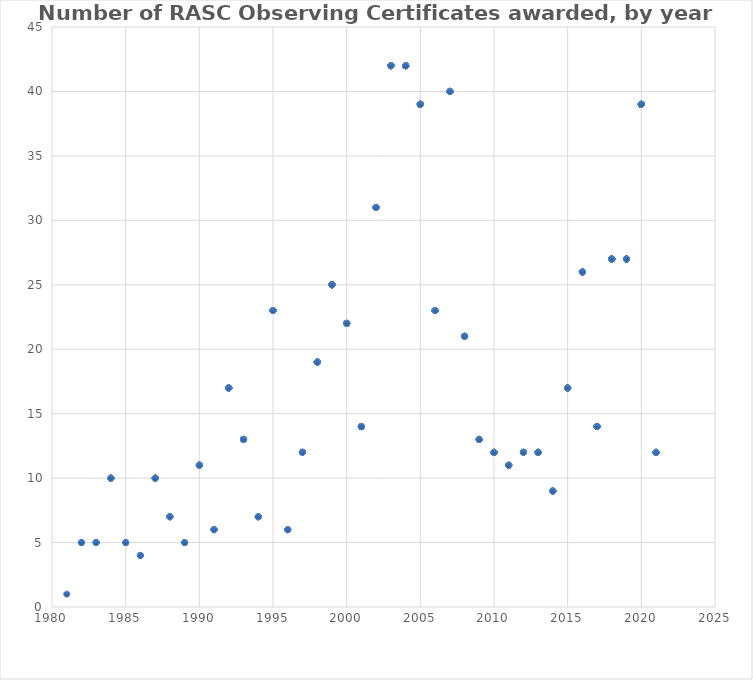
| Category | Series 0 |
|---|---|
| 2021.0 | 12 |
| 2021.0 | 12 |
| 2021.0 | 12 |
| 2021.0 | 12 |
| 2021.0 | 12 |
| 2021.0 | 12 |
| 2021.0 | 12 |
| 2021.0 | 12 |
| 2021.0 | 12 |
| 2021.0 | 12 |
| 2021.0 | 12 |
| 2021.0 | 12 |
| 2020.0 | 39 |
| 2020.0 | 39 |
| 2020.0 | 39 |
| 2020.0 | 39 |
| 2020.0 | 39 |
| 2020.0 | 39 |
| 2020.0 | 39 |
| 2020.0 | 39 |
| 2020.0 | 39 |
| 2020.0 | 39 |
| 2020.0 | 39 |
| 2020.0 | 39 |
| 2020.0 | 39 |
| 2020.0 | 39 |
| 2020.0 | 39 |
| 2020.0 | 39 |
| 2020.0 | 39 |
| 2020.0 | 39 |
| 2020.0 | 39 |
| 2020.0 | 39 |
| 2020.0 | 39 |
| 2020.0 | 39 |
| 2020.0 | 39 |
| 2020.0 | 39 |
| 2020.0 | 39 |
| 2020.0 | 39 |
| 2020.0 | 39 |
| 2020.0 | 39 |
| 2020.0 | 39 |
| 2020.0 | 39 |
| 2020.0 | 39 |
| 2020.0 | 39 |
| 2020.0 | 39 |
| 2020.0 | 39 |
| 2020.0 | 39 |
| 2020.0 | 39 |
| 2020.0 | 39 |
| 2020.0 | 39 |
| 2020.0 | 39 |
| 2019.0 | 27 |
| 2019.0 | 27 |
| 2019.0 | 27 |
| 2019.0 | 27 |
| 2019.0 | 27 |
| 2019.0 | 27 |
| 2019.0 | 27 |
| 2019.0 | 27 |
| 2019.0 | 27 |
| 2019.0 | 27 |
| 2019.0 | 27 |
| 2019.0 | 27 |
| 2019.0 | 27 |
| 2019.0 | 27 |
| 2019.0 | 27 |
| 2019.0 | 27 |
| 2019.0 | 27 |
| 2019.0 | 27 |
| 2019.0 | 27 |
| 2019.0 | 27 |
| 2019.0 | 27 |
| 2019.0 | 27 |
| 2019.0 | 27 |
| 2019.0 | 27 |
| 2019.0 | 27 |
| 2019.0 | 27 |
| 2019.0 | 27 |
| 2018.0 | 27 |
| 2018.0 | 27 |
| 2018.0 | 27 |
| 2018.0 | 27 |
| 2018.0 | 27 |
| 2018.0 | 27 |
| 2018.0 | 27 |
| 2018.0 | 27 |
| 2018.0 | 27 |
| 2018.0 | 27 |
| 2018.0 | 27 |
| 2018.0 | 27 |
| 2018.0 | 27 |
| 2018.0 | 27 |
| 2018.0 | 27 |
| 2018.0 | 27 |
| 2018.0 | 27 |
| 2018.0 | 27 |
| 2018.0 | 27 |
| 2018.0 | 27 |
| 2018.0 | 27 |
| 2018.0 | 27 |
| 2018.0 | 27 |
| 2018.0 | 27 |
| 2018.0 | 27 |
| 2018.0 | 27 |
| 2018.0 | 27 |
| 2017.0 | 14 |
| 2017.0 | 14 |
| 2017.0 | 14 |
| 2017.0 | 14 |
| 2017.0 | 14 |
| 2017.0 | 14 |
| 2017.0 | 14 |
| 2017.0 | 14 |
| 2017.0 | 14 |
| 2017.0 | 14 |
| 2017.0 | 14 |
| 2017.0 | 14 |
| 2017.0 | 14 |
| 2017.0 | 14 |
| 2016.0 | 26 |
| 2016.0 | 26 |
| 2016.0 | 26 |
| 2016.0 | 26 |
| 2016.0 | 26 |
| 2016.0 | 26 |
| 2016.0 | 26 |
| 2016.0 | 26 |
| 2016.0 | 26 |
| 2016.0 | 26 |
| 2016.0 | 26 |
| 2016.0 | 26 |
| 2016.0 | 26 |
| 2016.0 | 26 |
| 2016.0 | 26 |
| 2016.0 | 26 |
| 2016.0 | 26 |
| 2016.0 | 26 |
| 2016.0 | 26 |
| 2016.0 | 26 |
| 2016.0 | 26 |
| 2016.0 | 26 |
| 2016.0 | 26 |
| 2016.0 | 26 |
| 2016.0 | 26 |
| 2016.0 | 26 |
| 2015.0 | 17 |
| 2015.0 | 17 |
| 2015.0 | 17 |
| 2015.0 | 17 |
| 2015.0 | 17 |
| 2015.0 | 17 |
| 2015.0 | 17 |
| 2015.0 | 17 |
| 2015.0 | 17 |
| 2015.0 | 17 |
| 2015.0 | 17 |
| 2015.0 | 17 |
| 2015.0 | 17 |
| 2015.0 | 17 |
| 2015.0 | 17 |
| 2015.0 | 17 |
| 2015.0 | 17 |
| 2014.0 | 9 |
| 2014.0 | 9 |
| 2014.0 | 9 |
| 2014.0 | 9 |
| 2014.0 | 9 |
| 2014.0 | 9 |
| 2014.0 | 9 |
| 2014.0 | 9 |
| 2014.0 | 9 |
| 2013.0 | 12 |
| 2013.0 | 12 |
| 2013.0 | 12 |
| 2013.0 | 12 |
| 2013.0 | 12 |
| 2013.0 | 12 |
| 2013.0 | 12 |
| 2013.0 | 12 |
| 2013.0 | 12 |
| 2013.0 | 12 |
| 2013.0 | 12 |
| 2013.0 | 12 |
| 2012.0 | 12 |
| 2012.0 | 12 |
| 2012.0 | 12 |
| 2012.0 | 12 |
| 2012.0 | 12 |
| 2012.0 | 12 |
| 2012.0 | 12 |
| 2012.0 | 12 |
| 2012.0 | 12 |
| 2012.0 | 12 |
| 2012.0 | 12 |
| 2012.0 | 12 |
| 2011.0 | 11 |
| 2011.0 | 11 |
| 2011.0 | 11 |
| 2011.0 | 11 |
| 2011.0 | 11 |
| 2011.0 | 11 |
| 2011.0 | 11 |
| 2011.0 | 11 |
| 2011.0 | 11 |
| 2011.0 | 11 |
| 2011.0 | 11 |
| 2010.0 | 12 |
| 2010.0 | 12 |
| 2010.0 | 12 |
| 2010.0 | 12 |
| 2010.0 | 12 |
| 2010.0 | 12 |
| 2010.0 | 12 |
| 2010.0 | 12 |
| 2010.0 | 12 |
| 2010.0 | 12 |
| 2010.0 | 12 |
| 2010.0 | 12 |
| 2009.0 | 13 |
| 2009.0 | 13 |
| 2009.0 | 13 |
| 2009.0 | 13 |
| 2009.0 | 13 |
| 2009.0 | 13 |
| 2009.0 | 13 |
| 2009.0 | 13 |
| 2009.0 | 13 |
| 2009.0 | 13 |
| 2009.0 | 13 |
| 2009.0 | 13 |
| 2009.0 | 13 |
| 2008.0 | 21 |
| 2008.0 | 21 |
| 2008.0 | 21 |
| 2008.0 | 21 |
| 2008.0 | 21 |
| 2008.0 | 21 |
| 2008.0 | 21 |
| 2008.0 | 21 |
| 2008.0 | 21 |
| 2008.0 | 21 |
| 2008.0 | 21 |
| 2008.0 | 21 |
| 2008.0 | 21 |
| 2008.0 | 21 |
| 2008.0 | 21 |
| 2008.0 | 21 |
| 2008.0 | 21 |
| 2008.0 | 21 |
| 2008.0 | 21 |
| 2008.0 | 21 |
| 2008.0 | 21 |
| 2007.0 | 40 |
| 2007.0 | 40 |
| 2007.0 | 40 |
| 2007.0 | 40 |
| 2007.0 | 40 |
| 2007.0 | 40 |
| 2007.0 | 40 |
| 2007.0 | 40 |
| 2007.0 | 40 |
| 2007.0 | 40 |
| 2007.0 | 40 |
| 2007.0 | 40 |
| 2007.0 | 40 |
| 2007.0 | 40 |
| 2007.0 | 40 |
| 2007.0 | 40 |
| 2007.0 | 40 |
| 2007.0 | 40 |
| 2007.0 | 40 |
| 2007.0 | 40 |
| 2007.0 | 40 |
| 2007.0 | 40 |
| 2007.0 | 40 |
| 2007.0 | 40 |
| 2007.0 | 40 |
| 2007.0 | 40 |
| 2007.0 | 40 |
| 2007.0 | 40 |
| 2007.0 | 40 |
| 2007.0 | 40 |
| 2007.0 | 40 |
| 2007.0 | 40 |
| 2007.0 | 40 |
| 2007.0 | 40 |
| 2007.0 | 40 |
| 2007.0 | 40 |
| 2007.0 | 40 |
| 2007.0 | 40 |
| 2007.0 | 40 |
| 2007.0 | 40 |
| 2006.0 | 23 |
| 2006.0 | 23 |
| 2006.0 | 23 |
| 2006.0 | 23 |
| 2006.0 | 23 |
| 2006.0 | 23 |
| 2006.0 | 23 |
| 2006.0 | 23 |
| 2006.0 | 23 |
| 2006.0 | 23 |
| 2006.0 | 23 |
| 2006.0 | 23 |
| 2006.0 | 23 |
| 2006.0 | 23 |
| 2006.0 | 23 |
| 2006.0 | 23 |
| 2006.0 | 23 |
| 2006.0 | 23 |
| 2006.0 | 23 |
| 2006.0 | 23 |
| 2006.0 | 23 |
| 2006.0 | 23 |
| 2006.0 | 23 |
| 2005.0 | 39 |
| 2005.0 | 39 |
| 2005.0 | 39 |
| 2005.0 | 39 |
| 2005.0 | 39 |
| 2005.0 | 39 |
| 2005.0 | 39 |
| 2005.0 | 39 |
| 2005.0 | 39 |
| 2005.0 | 39 |
| 2005.0 | 39 |
| 2005.0 | 39 |
| 2005.0 | 39 |
| 2005.0 | 39 |
| 2005.0 | 39 |
| 2005.0 | 39 |
| 2005.0 | 39 |
| 2005.0 | 39 |
| 2005.0 | 39 |
| 2005.0 | 39 |
| 2005.0 | 39 |
| 2005.0 | 39 |
| 2005.0 | 39 |
| 2005.0 | 39 |
| 2005.0 | 39 |
| 2005.0 | 39 |
| 2005.0 | 39 |
| 2005.0 | 39 |
| 2005.0 | 39 |
| 2005.0 | 39 |
| 2005.0 | 39 |
| 2005.0 | 39 |
| 2005.0 | 39 |
| 2005.0 | 39 |
| 2005.0 | 39 |
| 2005.0 | 39 |
| 2005.0 | 39 |
| 2005.0 | 39 |
| 2005.0 | 39 |
| 2004.0 | 42 |
| 2004.0 | 42 |
| 2004.0 | 42 |
| 2004.0 | 42 |
| 2004.0 | 42 |
| 2004.0 | 42 |
| 2004.0 | 42 |
| 2004.0 | 42 |
| 2004.0 | 42 |
| 2004.0 | 42 |
| 2004.0 | 42 |
| 2004.0 | 42 |
| 2004.0 | 42 |
| 2004.0 | 42 |
| 2004.0 | 42 |
| 2004.0 | 42 |
| 2004.0 | 42 |
| 2004.0 | 42 |
| 2004.0 | 42 |
| 2004.0 | 42 |
| 2004.0 | 42 |
| 2004.0 | 42 |
| 2004.0 | 42 |
| 2004.0 | 42 |
| 2004.0 | 42 |
| 2004.0 | 42 |
| 2004.0 | 42 |
| 2004.0 | 42 |
| 2004.0 | 42 |
| 2004.0 | 42 |
| 2004.0 | 42 |
| 2004.0 | 42 |
| 2004.0 | 42 |
| 2004.0 | 42 |
| 2004.0 | 42 |
| 2004.0 | 42 |
| 2004.0 | 42 |
| 2004.0 | 42 |
| 2004.0 | 42 |
| 2004.0 | 42 |
| 2004.0 | 42 |
| 2004.0 | 42 |
| 2003.0 | 42 |
| 2003.0 | 42 |
| 2003.0 | 42 |
| 2003.0 | 42 |
| 2003.0 | 42 |
| 2003.0 | 42 |
| 2003.0 | 42 |
| 2003.0 | 42 |
| 2003.0 | 42 |
| 2003.0 | 42 |
| 2003.0 | 42 |
| 2003.0 | 42 |
| 2003.0 | 42 |
| 2003.0 | 42 |
| 2003.0 | 42 |
| 2003.0 | 42 |
| 2003.0 | 42 |
| 2003.0 | 42 |
| 2003.0 | 42 |
| 2003.0 | 42 |
| 2003.0 | 42 |
| 2003.0 | 42 |
| 2003.0 | 42 |
| 2003.0 | 42 |
| 2003.0 | 42 |
| 2003.0 | 42 |
| 2003.0 | 42 |
| 2003.0 | 42 |
| 2003.0 | 42 |
| 2003.0 | 42 |
| 2003.0 | 42 |
| 2003.0 | 42 |
| 2003.0 | 42 |
| 2003.0 | 42 |
| 2003.0 | 42 |
| 2003.0 | 42 |
| 2003.0 | 42 |
| 2003.0 | 42 |
| 2003.0 | 42 |
| 2003.0 | 42 |
| 2003.0 | 42 |
| 2003.0 | 42 |
| 2002.0 | 31 |
| 2002.0 | 31 |
| 2002.0 | 31 |
| 2002.0 | 31 |
| 2002.0 | 31 |
| 2002.0 | 31 |
| 2002.0 | 31 |
| 2002.0 | 31 |
| 2002.0 | 31 |
| 2002.0 | 31 |
| 2002.0 | 31 |
| 2002.0 | 31 |
| 2002.0 | 31 |
| 2002.0 | 31 |
| 2002.0 | 31 |
| 2002.0 | 31 |
| 2002.0 | 31 |
| 2002.0 | 31 |
| 2002.0 | 31 |
| 2002.0 | 31 |
| 2002.0 | 31 |
| 2002.0 | 31 |
| 2002.0 | 31 |
| 2002.0 | 31 |
| 2002.0 | 31 |
| 2002.0 | 31 |
| 2002.0 | 31 |
| 2002.0 | 31 |
| 2002.0 | 31 |
| 2002.0 | 31 |
| 2002.0 | 31 |
| 2001.0 | 14 |
| 2001.0 | 14 |
| 2001.0 | 14 |
| 2001.0 | 14 |
| 2001.0 | 14 |
| 2001.0 | 14 |
| 2001.0 | 14 |
| 2001.0 | 14 |
| 2001.0 | 14 |
| 2001.0 | 14 |
| 2001.0 | 14 |
| 2001.0 | 14 |
| 2001.0 | 14 |
| 2001.0 | 14 |
| 2000.0 | 22 |
| 2000.0 | 22 |
| 2000.0 | 22 |
| 2000.0 | 22 |
| 2000.0 | 22 |
| 2000.0 | 22 |
| 2000.0 | 22 |
| 2000.0 | 22 |
| 2000.0 | 22 |
| 2000.0 | 22 |
| 2000.0 | 22 |
| 2000.0 | 22 |
| 2000.0 | 22 |
| 2000.0 | 22 |
| 2000.0 | 22 |
| 2000.0 | 22 |
| 2000.0 | 22 |
| 2000.0 | 22 |
| 2000.0 | 22 |
| 2000.0 | 22 |
| 2000.0 | 22 |
| 2000.0 | 22 |
| 1999.0 | 25 |
| 1999.0 | 25 |
| 1999.0 | 25 |
| 1999.0 | 25 |
| 1999.0 | 25 |
| 1999.0 | 25 |
| 1999.0 | 25 |
| 1999.0 | 25 |
| 1999.0 | 25 |
| 1999.0 | 25 |
| 1999.0 | 25 |
| 1999.0 | 25 |
| 1999.0 | 25 |
| 1999.0 | 25 |
| 1999.0 | 25 |
| 1999.0 | 25 |
| 1999.0 | 25 |
| 1999.0 | 25 |
| 1999.0 | 25 |
| 1999.0 | 25 |
| 1999.0 | 25 |
| 1999.0 | 25 |
| 1999.0 | 25 |
| 1999.0 | 25 |
| 1999.0 | 25 |
| 1998.0 | 19 |
| 1998.0 | 19 |
| 1998.0 | 19 |
| 1998.0 | 19 |
| 1998.0 | 19 |
| 1998.0 | 19 |
| 1998.0 | 19 |
| 1998.0 | 19 |
| 1998.0 | 19 |
| 1998.0 | 19 |
| 1998.0 | 19 |
| 1998.0 | 19 |
| 1998.0 | 19 |
| 1998.0 | 19 |
| 1998.0 | 19 |
| 1998.0 | 19 |
| 1998.0 | 19 |
| 1998.0 | 19 |
| 1998.0 | 19 |
| 1997.0 | 12 |
| 1997.0 | 12 |
| 1997.0 | 12 |
| 1997.0 | 12 |
| 1997.0 | 12 |
| 1997.0 | 12 |
| 1997.0 | 12 |
| 1997.0 | 12 |
| 1997.0 | 12 |
| 1997.0 | 12 |
| 1997.0 | 12 |
| 1997.0 | 12 |
| 1996.0 | 6 |
| 1996.0 | 6 |
| 1996.0 | 6 |
| 1996.0 | 6 |
| 1996.0 | 6 |
| 1996.0 | 6 |
| 1995.0 | 23 |
| 1995.0 | 23 |
| 1995.0 | 23 |
| 1995.0 | 23 |
| 1995.0 | 23 |
| 1995.0 | 23 |
| 1995.0 | 23 |
| 1995.0 | 23 |
| 1995.0 | 23 |
| 1995.0 | 23 |
| 1995.0 | 23 |
| 1995.0 | 23 |
| 1995.0 | 23 |
| 1995.0 | 23 |
| 1995.0 | 23 |
| 1995.0 | 23 |
| 1995.0 | 23 |
| 1995.0 | 23 |
| 1995.0 | 23 |
| 1995.0 | 23 |
| 1995.0 | 23 |
| 1995.0 | 23 |
| 1995.0 | 23 |
| 1994.0 | 7 |
| 1994.0 | 7 |
| 1994.0 | 7 |
| 1994.0 | 7 |
| 1994.0 | 7 |
| 1994.0 | 7 |
| 1994.0 | 7 |
| 1993.0 | 13 |
| 1993.0 | 13 |
| 1993.0 | 13 |
| 1993.0 | 13 |
| 1993.0 | 13 |
| 1993.0 | 13 |
| 1993.0 | 13 |
| 1993.0 | 13 |
| 1993.0 | 13 |
| 1993.0 | 13 |
| 1993.0 | 13 |
| 1993.0 | 13 |
| 1993.0 | 13 |
| 1992.0 | 17 |
| 1992.0 | 17 |
| 1992.0 | 17 |
| 1992.0 | 17 |
| 1992.0 | 17 |
| 1992.0 | 17 |
| 1992.0 | 17 |
| 1992.0 | 17 |
| 1992.0 | 17 |
| 1992.0 | 17 |
| 1992.0 | 17 |
| 1992.0 | 17 |
| 1992.0 | 17 |
| 1992.0 | 17 |
| 1992.0 | 17 |
| 1992.0 | 17 |
| 1992.0 | 17 |
| 1991.0 | 6 |
| 1991.0 | 6 |
| 1991.0 | 6 |
| 1991.0 | 6 |
| 1991.0 | 6 |
| 1991.0 | 6 |
| 1990.0 | 11 |
| 1990.0 | 11 |
| 1990.0 | 11 |
| 1990.0 | 11 |
| 1990.0 | 11 |
| 1990.0 | 11 |
| 1990.0 | 11 |
| 1990.0 | 11 |
| 1990.0 | 11 |
| 1990.0 | 11 |
| 1990.0 | 11 |
| 1989.0 | 5 |
| 1989.0 | 5 |
| 1989.0 | 5 |
| 1989.0 | 5 |
| 1989.0 | 5 |
| 1988.0 | 7 |
| 1988.0 | 7 |
| 1988.0 | 7 |
| 1988.0 | 7 |
| 1988.0 | 7 |
| 1988.0 | 7 |
| 1988.0 | 7 |
| 1987.0 | 10 |
| 1987.0 | 10 |
| 1987.0 | 10 |
| 1987.0 | 10 |
| 1987.0 | 10 |
| 1987.0 | 10 |
| 1987.0 | 10 |
| 1987.0 | 10 |
| 1987.0 | 10 |
| 1987.0 | 10 |
| 1986.0 | 4 |
| 1986.0 | 4 |
| 1986.0 | 4 |
| 1986.0 | 4 |
| 1985.0 | 5 |
| 1985.0 | 5 |
| 1985.0 | 5 |
| 1985.0 | 5 |
| 1985.0 | 5 |
| 1984.0 | 10 |
| 1984.0 | 10 |
| 1984.0 | 10 |
| 1984.0 | 10 |
| 1984.0 | 10 |
| 1984.0 | 10 |
| 1984.0 | 10 |
| 1984.0 | 10 |
| 1984.0 | 10 |
| 1984.0 | 10 |
| 1983.0 | 5 |
| 1983.0 | 5 |
| 1983.0 | 5 |
| 1983.0 | 5 |
| 1983.0 | 5 |
| 1982.0 | 5 |
| 1982.0 | 5 |
| 1982.0 | 5 |
| 1982.0 | 5 |
| 1982.0 | 5 |
| 1981.0 | 1 |